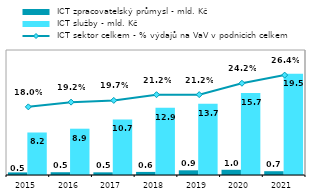
| Category |  ICT zpracovatelský průmysl - mld. Kč |  ICT služby - mld. Kč |
|---|---|---|
| 2015.0 | 0.5 | 8.162 |
| 2016.0 | 0.532 | 8.889 |
| 2017.0 | 0.512 | 10.677 |
| 2018.0 | 0.591 | 12.903 |
| 2019.0 | 0.902 | 13.698 |
| 2020.0 | 0.999 | 15.74 |
| 2021.0 | 0.727 | 19.463 |